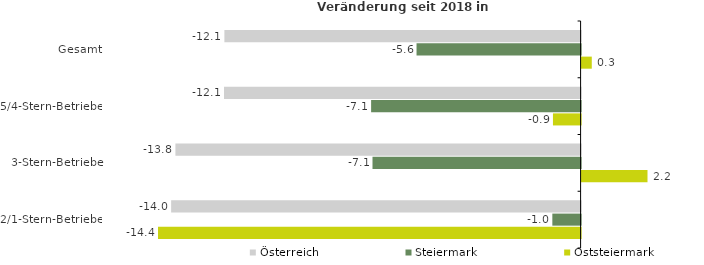
| Category | Österreich | Steiermark | Oststeiermark |
|---|---|---|---|
| Gesamt | -12.137 | -5.59 | 0.347 |
| 5/4-Stern-Betriebe | -12.15 | -7.138 | -0.942 |
| 3-Stern-Betriebe | -13.805 | -7.09 | 2.246 |
| 2/1-Stern-Betriebe | -13.951 | -0.963 | -14.398 |